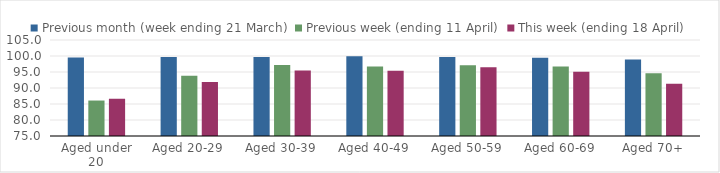
| Category | Previous month (week ending 21 March) | Previous week (ending 11 April) | This week (ending 18 April) |
|---|---|---|---|
| Aged under 20 | 99.559 | 86.083 | 86.64 |
| Aged 20-29 | 99.657 | 93.84 | 91.842 |
| Aged 30-39 | 99.677 | 97.206 | 95.503 |
| Aged 40-49 | 99.925 | 96.69 | 95.417 |
| Aged 50-59 | 99.695 | 97.119 | 96.463 |
| Aged 60-69 | 99.471 | 96.727 | 95.06 |
| Aged 70+ | 98.931 | 94.603 | 91.289 |